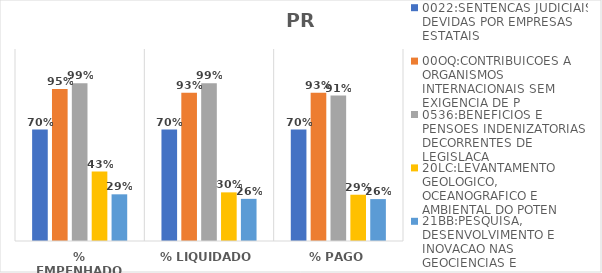
| Category | 0022:SENTENCAS JUDICIAIS DEVIDAS POR EMPRESAS ESTATAIS | 00OQ:CONTRIBUICOES A ORGANISMOS INTERNACIONAIS SEM EXIGENCIA DE P | 0536:BENEFICIOS E PENSOES INDENIZATORIAS DECORRENTES DE LEGISLACA | 20LC:LEVANTAMENTO GEOLOGICO, OCEANOGRAFICO E AMBIENTAL DO POTEN | 21BB:PESQUISA, DESENVOLVIMENTO E INOVACAO NAS GEOCIENCIAS E |
|---|---|---|---|---|---|
| % EMPENHADO | 0.697 | 0.95 | 0.985 | 0.434 | 0.292 |
| % LIQUIDADO | 0.697 | 0.926 | 0.985 | 0.304 | 0.263 |
| % PAGO | 0.697 | 0.926 | 0.909 | 0.289 | 0.262 |